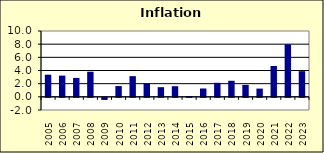
| Category | 2.3 |
|---|---|
| 2005.0 | 3.366 |
| 2006.0 | 3.222 |
| 2007.0 | 2.871 |
| 2008.0 | 3.815 |
| 2009.0 | -0.32 |
| 2010.0 | 1.637 |
| 2011.0 | 3.14 |
| 2012.0 | 2.073 |
| 2013.0 | 1.466 |
| 2014.0 | 1.615 |
| 2015.0 | 0.121 |
| 2016.0 | 1.267 |
| 2017.0 | 2.131 |
| 2018.0 | 2.439 |
| 2019.0 | 1.813 |
| 2020.0 | 1.251 |
| 2021.0 | 4.683 |
| 2022.0 | 7.986 |
| 2023.0 | 3.9 |